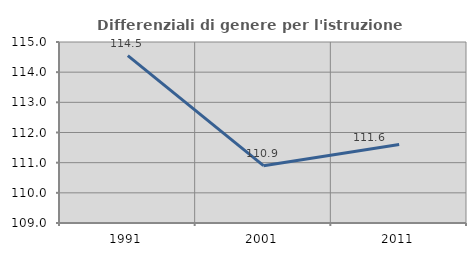
| Category | Differenziali di genere per l'istruzione superiore |
|---|---|
| 1991.0 | 114.549 |
| 2001.0 | 110.9 |
| 2011.0 | 111.601 |